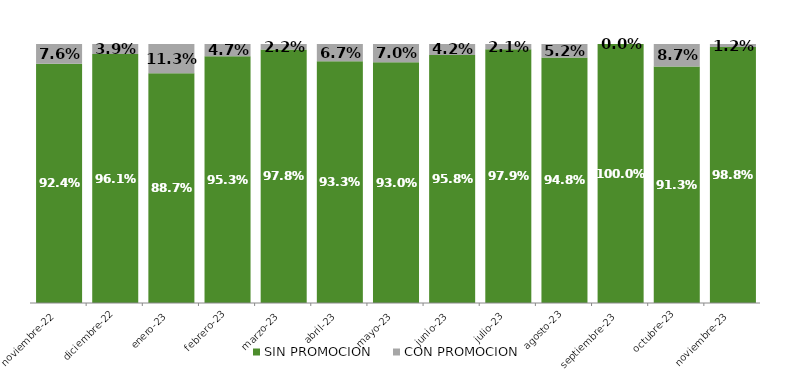
| Category | SIN PROMOCION   | CON PROMOCION   |
|---|---|---|
| 2022-11-01 | 0.924 | 0.076 |
| 2022-12-01 | 0.961 | 0.039 |
| 2023-01-01 | 0.887 | 0.113 |
| 2023-02-01 | 0.953 | 0.047 |
| 2023-03-01 | 0.978 | 0.022 |
| 2023-04-01 | 0.933 | 0.067 |
| 2023-05-01 | 0.93 | 0.07 |
| 2023-06-01 | 0.958 | 0.042 |
| 2023-07-01 | 0.979 | 0.021 |
| 2023-08-01 | 0.948 | 0.052 |
| 2023-09-01 | 1 | 0 |
| 2023-10-01 | 0.913 | 0.087 |
| 2023-11-01 | 0.988 | 0.012 |